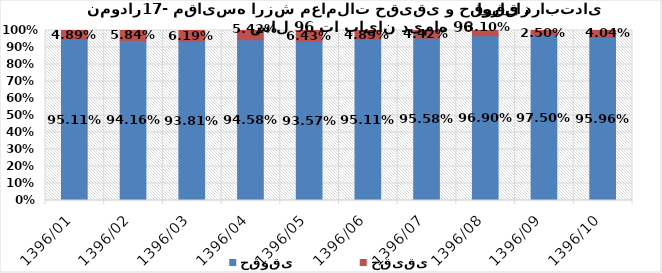
| Category | حقوقی | حقیقی |
|---|---|---|
| 1396/01 | 0.951 | 0.049 |
| 1396/02 | 0.942 | 0.058 |
| 1396/03 | 0.938 | 0.062 |
| 1396/04 | 0.946 | 0.054 |
| 1396/05 | 0.936 | 0.064 |
| 1396/06 | 0.951 | 0.049 |
| 1396/07 | 0.956 | 0.044 |
| 1396/08 | 0.969 | 0.031 |
| 1396/09 | 0.975 | 0.025 |
| 1396/10 | 0.96 | 0.04 |